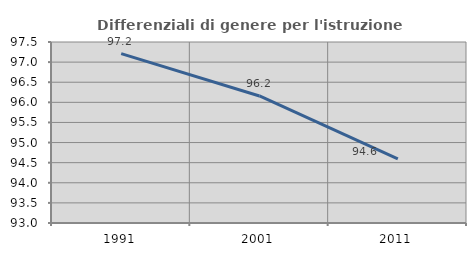
| Category | Differenziali di genere per l'istruzione superiore |
|---|---|
| 1991.0 | 97.21 |
| 2001.0 | 96.159 |
| 2011.0 | 94.596 |